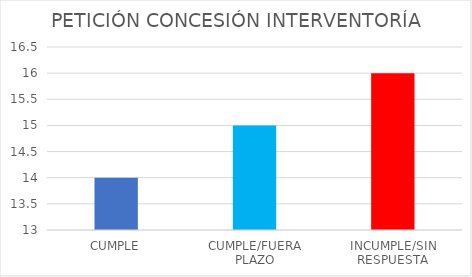
| Category | TOTAL |
|---|---|
| CUMPLE | 14 |
| CUMPLE/FUERA PLAZO | 15 |
| INCUMPLE/SIN RESPUESTA | 16 |